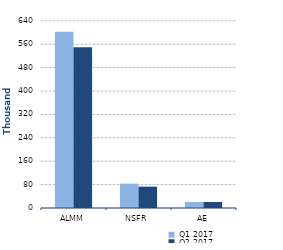
| Category | Q1 2017 | Q2 2017 |
|---|---|---|
| 0 | 602362 | 549331 |
| 1/1/00 | 83323 | 72992 |
| 1/2/00 | 20496 | 20430 |